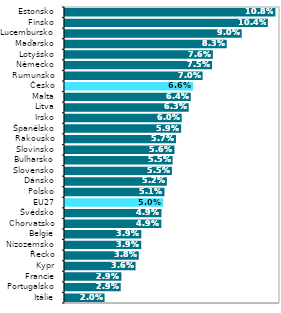
| Category | Series 0 |
|---|---|
| Itálie | 0.02 |
| Portugalsko | 0.029 |
| Francie | 0.029 |
| Kypr | 0.036 |
| Řecko | 0.038 |
| Nizozemsko | 0.039 |
| Belgie | 0.039 |
| Chorvatsko | 0.049 |
| Švédsko | 0.049 |
| EU27 | 0.05 |
| Polsko | 0.051 |
| Dánsko | 0.052 |
| Slovensko | 0.055 |
| Bulharsko | 0.055 |
| Slovinsko | 0.056 |
| Rakousko | 0.057 |
| Španělsko | 0.059 |
| Irsko | 0.06 |
| Litva | 0.063 |
| Malta | 0.064 |
| Česko | 0.066 |
| Rumunsko | 0.07 |
| Německo | 0.075 |
| Lotyšsko | 0.076 |
| Maďarsko | 0.083 |
| Lucembursko | 0.09 |
| Finsko | 0.104 |
| Estonsko | 0.108 |